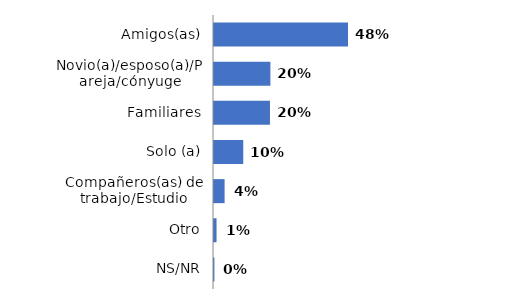
| Category | Series 0 |
|---|---|
| Amigos(as) | 0.475 |
| Novio(a)/esposo(a)/Pareja/cónyuge | 0.2 |
| Familiares | 0.198 |
| Solo (a) | 0.104 |
| Compañeros(as) de trabajo/Estudio | 0.038 |
| Otro | 0.009 |
| NS/NR | 0.002 |